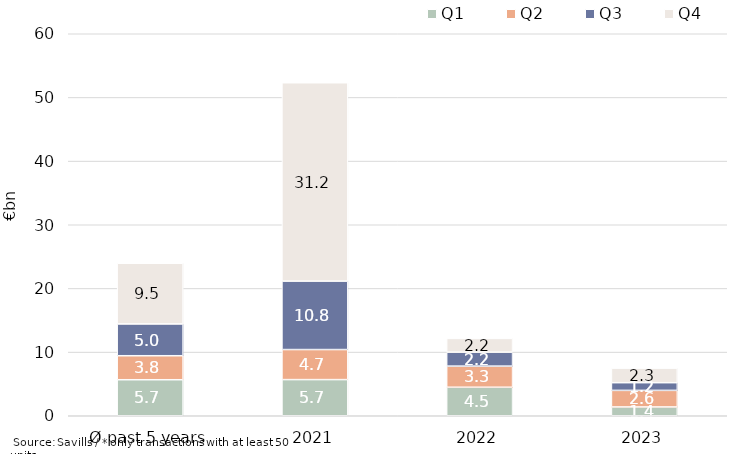
| Category | Q1 | Q2 | Q3 | Q4 |
|---|---|---|---|---|
| Ø past 5 years | 5658965765.166 | 3769832451.908 | 4997300272.744 | 9526306588.076 |
| 2021 | 5676886758 | 4721007645 | 10751893445.75 | 31156264639.5 |
| 2022 | 4477957320.54 | 3321253136 | 2192659976.13 | 2158741060 |
| 2023 | 1382171561.98 | 2605240695.42 | 1206888604.76 | 2284345991.85 |